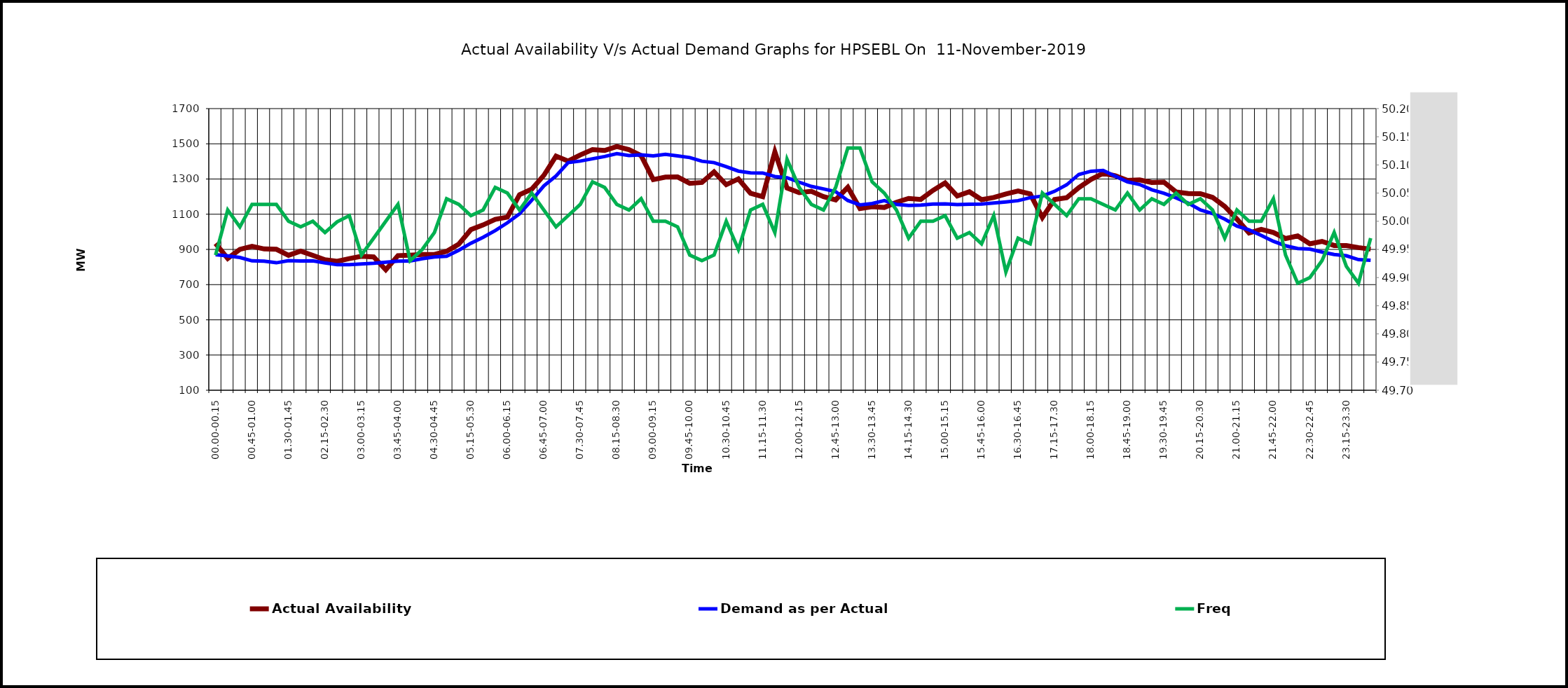
| Category | Actual Availability | Demand as per Actual |
|---|---|---|
| 00.00-00.15 | 934.005 | 870 |
| 00.15-00.30 | 848.737 | 863 |
| 00.30-00.45 | 900.267 | 854 |
| 00.45-01.00 | 917.634 | 835 |
| 01.00-01.15 | 902.648 | 833 |
| 01.15-01.30 | 900.611 | 824 |
| 01.30-01.45 | 866.731 | 836 |
| 01.45-02:00 | 890.049 | 834 |
| 02.00-02.15 | 866.049 | 835 |
| 02.15-02.30 | 841.286 | 823 |
| 02.30-02.45 | 832.89 | 813 |
| 02.45-03:00 | 847.88 | 813 |
| 03.00-03.15 | 860.722 | 817 |
| 03.15-03.30 | 857.341 | 821 |
| 03.30-03.45 | 784.381 | 827 |
| 03.45-04.00 | 864.865 | 833 |
| 04.00-04.15 | 866.916 | 834 |
| 04.15-04.30 | 870.916 | 847 |
| 04.30-04.45 | 871.566 | 857 |
| 04.45-05.00 | 889.309 | 861 |
| 05.00-05.15 | 929.713 | 895 |
| 05.15-05.30 | 1012.279 | 935 |
| 05.30-05.45 | 1038.782 | 969 |
| 05.45-06.00 | 1070.517 | 1007 |
| 06.00-06.15 | 1083.56 | 1051 |
| 06.15-06.30 | 1210.988 | 1102 |
| 06.30-06.45 | 1242.085 | 1179 |
| 06.45-07.00 | 1320.851 | 1261 |
| 07.00-07.15 | 1430.047 | 1317 |
| 07.15-07.30 | 1401.744 | 1393 |
| 07.30-07.45 | 1437.047 | 1402 |
| 07.45-08.00 | 1466.744 | 1415 |
| 08.00-08.15 | 1462.19 | 1428 |
| 08.15-08.30 | 1484.79 | 1444 |
| 08.30-08.45 | 1466.877 | 1433 |
| 08.45-09.00 | 1433.102 | 1437 |
| 09.00-09.15 | 1296.52 | 1431 |
| 09.15-09.30 | 1310.498 | 1440 |
| 09.30-09.45 | 1311.783 | 1431 |
| 09.45-10.00 | 1275.424 | 1422 |
| 10.00-10.15 | 1280.361 | 1401 |
| 10.15-10.30 | 1340.1 | 1393 |
| 10.30-10.45 | 1267.926 | 1370 |
| 10.45-11.00 | 1300.347 | 1345 |
| 11.00-11.15 | 1218.816 | 1335 |
| 11.15-11.30 | 1200.095 | 1334 |
| 11.30-11.45 | 1454.375 | 1314 |
| 11.45-12.00 | 1249.035 | 1307 |
| 12.00-12.15 | 1222.356 | 1282 |
| 12.15-12.30 | 1230.312 | 1258 |
| 12.30-12.45 | 1199.927 | 1244 |
| 12.45-13.00 | 1181.637 | 1228 |
| 13.00-13.15 | 1252.92 | 1178 |
| 13.15-13.30 | 1131.749 | 1153 |
| 13.30-13.45 | 1142.666 | 1161 |
| 13.45-14.00 | 1138.45 | 1177 |
| 14.00-14.15 | 1168.008 | 1156 |
| 14.15-14.30 | 1189.794 | 1150 |
| 14.30-14.45 | 1183.917 | 1152 |
| 14.45-15.00 | 1235.107 | 1158 |
| 15.00-15.15 | 1277.906 | 1159 |
| 15.15-15.30 | 1203.381 | 1155 |
| 15.30-15.45 | 1227.539 | 1157 |
| 15.45-16.00 | 1182.555 | 1158 |
| 16.00-16.15 | 1194.777 | 1164 |
| 16.15-16.30 | 1214.616 | 1170 |
| 16.30-16.45 | 1231.595 | 1177 |
| 16.45-17.00 | 1214.906 | 1194 |
| 17.00-17.15 | 1081.364 | 1203 |
| 17.15-17.30 | 1183.376 | 1230 |
| 17.30-17.45 | 1193.964 | 1267 |
| 17.45-18.00 | 1250.957 | 1326 |
| 18.00-18.15 | 1297.75 | 1344 |
| 18.15-18.30 | 1332.068 | 1349 |
| 18.30-18.45 | 1318.503 | 1316 |
| 18.45-19.00 | 1291.663 | 1284 |
| 19.00-19.15 | 1294.862 | 1269 |
| 19.15-19.30 | 1280.281 | 1239 |
| 19.30-19.45 | 1282.115 | 1219 |
| 19.45-20.00 | 1226.682 | 1193 |
| 20.00-20.15 | 1217.22 | 1163 |
| 20.15-20.30 | 1216.497 | 1124 |
| 20.30-20.45 | 1195.347 | 1104 |
| 20.45-21.00 | 1144.327 | 1072 |
| 21.00-21.15 | 1072.274 | 1033 |
| 21.15-21.30 | 993.569 | 1011 |
| 21.30-21.45 | 1014.033 | 980 |
| 21.45-22.00 | 996.041 | 946 |
| 22.00-22.15 | 961.827 | 921 |
| 22.15-22.30 | 976.253 | 905 |
| 22.30-22.45 | 931.93 | 902 |
| 22.45-23.00 | 945.737 | 885 |
| 23.00-23.15 | 922.2 | 871 |
| 23.15-23.30 | 921.925 | 864 |
| 23.30-23.45 | 910.548 | 842 |
| 23.45-24.00 | 901.508 | 838 |